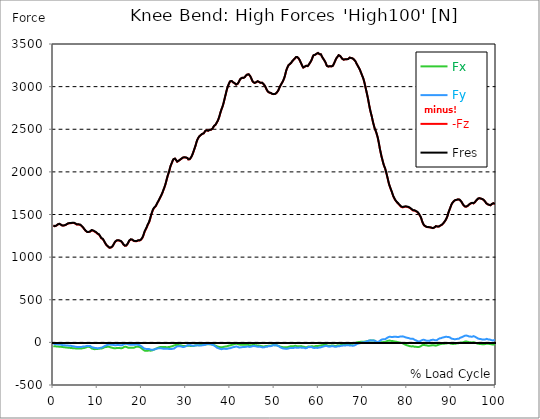
| Category |  Fx |  Fy |  -Fz |  Fres |
|---|---|---|---|---|
| 0.0 | -44.084 | -17.142 | 1370.774 | 1371.817 |
| 0.167348456675344 | -44.472 | -17.321 | 1363.819 | 1364.862 |
| 0.334696913350688 | -45.172 | -18.647 | 1362.27 | 1363.313 |
| 0.5020453700260321 | -45.976 | -20.017 | 1364.683 | 1365.77 |
| 0.669393826701376 | -47.54 | -22.668 | 1368.957 | 1370.194 |
| 0.83674228337672 | -48.687 | -23.651 | 1377.864 | 1379.159 |
| 1.0040907400520642 | -48.597 | -22.757 | 1382.838 | 1384.164 |
| 1.1621420602454444 | -49.297 | -23.025 | 1387.425 | 1388.81 |
| 1.3294905169207885 | -51.144 | -25.468 | 1389.838 | 1391.402 |
| 1.4968389735961325 | -50.533 | -24.649 | 1388.006 | 1389.525 |
| 1.6641874302714765 | -50.489 | -25.259 | 1381.051 | 1382.51 |
| 1.8315358869468206 | -53.184 | -29.28 | 1371.921 | 1373.44 |
| 1.9988843436221646 | -54.703 | -32.006 | 1369.866 | 1371.445 |
| 2.1662328002975086 | -55.15 | -32.274 | 1369.389 | 1370.998 |
| 2.333581256972853 | -56.193 | -33.034 | 1370.402 | 1372.07 |
| 2.5009297136481967 | -57.444 | -34.076 | 1371.757 | 1373.5 |
| 2.6682781703235405 | -58.203 | -34.687 | 1374.23 | 1376.002 |
| 2.8356266269988843 | -59.663 | -36.027 | 1377.551 | 1379.442 |
| 3.002975083674229 | -61.078 | -37.234 | 1383.925 | 1385.876 |
| 3.1703235403495724 | -61.54 | -37.457 | 1389.272 | 1391.253 |
| 3.337671997024917 | -62.001 | -37.68 | 1394.619 | 1396.629 |
| 3.4957233172182973 | -63.431 | -39.631 | 1397.3 | 1399.4 |
| 3.663071773893641 | -64.28 | -40.54 | 1397.032 | 1399.191 |
| 3.8304202305689854 | -64.161 | -39.914 | 1396.868 | 1398.997 |
| 3.997768687244329 | -64.95 | -41.002 | 1398.089 | 1400.308 |
| 4.165117143919673 | -66.395 | -42.953 | 1400.025 | 1402.393 |
| 4.332465600595017 | -67.944 | -44.904 | 1401.5 | 1404.046 |
| 4.499814057270361 | -68.748 | -46.527 | 1401.812 | 1404.478 |
| 4.667162513945706 | -69.195 | -47.823 | 1401.202 | 1403.942 |
| 4.834510970621049 | -69.359 | -48.791 | 1397.493 | 1400.219 |
| 5.001859427296393 | -70.729 | -50.787 | 1391.715 | 1394.544 |
| 5.169207883971737 | -72.114 | -52.767 | 1385.921 | 1388.87 |
| 5.336556340647081 | -73.216 | -54.391 | 1381.081 | 1384.134 |
| 5.503904797322425 | -72.442 | -53.825 | 1381.349 | 1384.327 |
| 5.671253253997769 | -71.488 | -53.274 | 1381.691 | 1384.61 |
| 5.82930457419115 | -71.399 | -53.289 | 1382.615 | 1385.504 |
| 5.996653030866494 | -71.965 | -54.733 | 1380.172 | 1383.151 |
| 6.164001487541838 | -72.218 | -55.761 | 1376.315 | 1379.353 |
| 6.331349944217181 | -71.503 | -55.523 | 1367.349 | 1370.357 |
| 6.498698400892526 | -69.537 | -51.68 | 1361.153 | 1363.909 |
| 6.66604685756787 | -67.974 | -49.193 | 1350.207 | 1352.813 |
| 6.833395314243213 | -66.633 | -47.644 | 1338.173 | 1340.675 |
| 7.000743770918558 | -66.037 | -48.299 | 1326.362 | 1328.909 |
| 7.168092227593902 | -63.684 | -47.272 | 1316.175 | 1318.588 |
| 7.335440684269246 | -60.259 | -45.231 | 1306.941 | 1309.16 |
| 7.50278914094459 | -56.833 | -43.176 | 1297.707 | 1299.733 |
| 7.6701375976199335 | -52.842 | -41.002 | 1293.537 | 1295.369 |
| 7.837486054295278 | -51.71 | -39.84 | 1294.401 | 1296.233 |
| 7.995537374488658 | -52.529 | -41.836 | 1294.252 | 1296.248 |
| 8.162885831164003 | -53.855 | -42.193 | 1296.382 | 1298.512 |
| 8.330234287839346 | -55.672 | -42.685 | 1299.807 | 1302.071 |
| 8.49758274451469 | -63.178 | -49.387 | 1309.518 | 1312.228 |
| 8.664931201190035 | -71.19 | -56.103 | 1315.118 | 1318.305 |
| 8.832279657865378 | -75.465 | -59.559 | 1313.033 | 1316.607 |
| 8.999628114540721 | -76.597 | -60.08 | 1308.982 | 1312.675 |
| 9.166976571216066 | -78.205 | -61.644 | 1304.29 | 1308.163 |
| 9.334325027891412 | -80.082 | -64.474 | 1298.929 | 1303.084 |
| 9.501673484566755 | -78.727 | -64.727 | 1292.748 | 1296.844 |
| 9.669021941242098 | -77.937 | -66.737 | 1288.429 | 1292.584 |
| 9.836370397917442 | -78.265 | -69.329 | 1283.499 | 1287.848 |
| 10.003718854592787 | -77.297 | -69.12 | 1272.463 | 1276.797 |
| 10.17106731126813 | -75.435 | -67.795 | 1266.521 | 1270.691 |
| 10.329118631461512 | -73.827 | -66.946 | 1263.125 | 1267.161 |
| 10.496467088136853 | -73.439 | -66.603 | 1251.731 | 1255.782 |
| 10.663815544812199 | -72.501 | -64.34 | 1235.617 | 1239.549 |
| 10.831164001487544 | -71.92 | -61.793 | 1220.589 | 1224.402 |
| 10.998512458162887 | -70.684 | -60.125 | 1217.938 | 1221.602 |
| 11.16586091483823 | -67.616 | -56.61 | 1211.951 | 1215.302 |
| 11.333209371513574 | -63.297 | -51.531 | 1200.826 | 1203.775 |
| 11.50055782818892 | -58.323 | -45.455 | 1184.741 | 1187.258 |
| 11.667906284864264 | -55.597 | -40.778 | 1168.313 | 1170.607 |
| 11.835254741539607 | -53.81 | -37.144 | 1153.509 | 1155.624 |
| 12.00260319821495 | -53.438 | -34.553 | 1141.163 | 1143.158 |
| 12.169951654890292 | -53.08 | -31.38 | 1132.137 | 1133.999 |
| 12.337300111565641 | -51.725 | -27.672 | 1125.018 | 1126.731 |
| 12.504648568240984 | -51.055 | -25.229 | 1117.78 | 1119.418 |
| 12.662699888434362 | -52.708 | -24.961 | 1109.216 | 1110.899 |
| 12.830048345109708 | -55.895 | -25.483 | 1107.921 | 1109.723 |
| 12.997396801785053 | -60.02 | -27.225 | 1111.897 | 1113.938 |
| 13.164745258460396 | -63.654 | -28.015 | 1116.306 | 1118.51 |
| 13.33209371513574 | -63.371 | -28.074 | 1124.05 | 1126.195 |
| 13.499442171811083 | -65.337 | -29.072 | 1135.712 | 1137.976 |
| 13.666790628486426 | -68.003 | -31.321 | 1151.558 | 1154.001 |
| 13.834139085161771 | -69.925 | -32.795 | 1168.15 | 1170.711 |
| 14.001487541837117 | -69.15 | -33.585 | 1180.645 | 1183.162 |
| 14.16883599851246 | -67.884 | -32.825 | 1188.643 | 1191.041 |
| 14.336184455187803 | -66.127 | -32.08 | 1194.288 | 1196.551 |
| 14.503532911863147 | -65.576 | -31.678 | 1197.043 | 1199.277 |
| 14.670881368538492 | -65.084 | -31.187 | 1196.819 | 1199.009 |
| 14.828932688731873 | -64.861 | -31.038 | 1194.436 | 1196.626 |
| 14.996281145407215 | -66.142 | -32.617 | 1191.86 | 1194.168 |
| 15.163629602082558 | -68.018 | -34.061 | 1188.36 | 1190.847 |
| 15.330978058757903 | -69.835 | -35.312 | 1184.383 | 1187.049 |
| 15.498326515433247 | -68.554 | -33.465 | 1174.747 | 1177.279 |
| 15.665674972108594 | -65.144 | -30.159 | 1162.624 | 1164.888 |
| 15.833023428783937 | -60.244 | -25.9 | 1148.416 | 1150.307 |
| 16.00037188545928 | -53.78 | -20.627 | 1139.882 | 1141.52 |
| 16.167720342134626 | -48.314 | -15.921 | 1133.195 | 1134.654 |
| 16.335068798809967 | -49.878 | -15.459 | 1133.329 | 1134.982 |
| 16.502417255485312 | -52.38 | -15.504 | 1135.354 | 1137.216 |
| 16.669765712160658 | -56.908 | -18.468 | 1144.261 | 1146.405 |
| 16.837114168836 | -61.793 | -22.534 | 1158.737 | 1161.299 |
| 17.004462625511344 | -64.161 | -25.155 | 1175.254 | 1178.039 |
| 17.16251394570472 | -65.293 | -26.912 | 1192.143 | 1195.032 |
| 17.32986240238007 | -64.563 | -26.987 | 1202.836 | 1205.577 |
| 17.497210859055414 | -62.999 | -26.168 | 1206.902 | 1209.33 |
| 17.664559315730756 | -63.446 | -27.24 | 1206.724 | 1209.032 |
| 17.8319077724061 | -64.28 | -28.774 | 1203.536 | 1205.815 |
| 17.999256229081443 | -64.101 | -28.908 | 1196.015 | 1198.264 |
| 18.166604685756788 | -62.463 | -28.149 | 1189.73 | 1191.92 |
| 18.333953142432133 | -60.765 | -28.208 | 1187.466 | 1189.551 |
| 18.501301599107478 | -56.446 | -26.704 | 1186.632 | 1188.568 |
| 18.668650055782823 | -52.514 | -25.274 | 1185.858 | 1187.749 |
| 18.835998512458165 | -48.955 | -24.023 | 1186.811 | 1188.673 |
| 19.00334696913351 | -49.312 | -25.438 | 1191.741 | 1193.588 |
| 19.170695425808855 | -51.01 | -27.717 | 1195.688 | 1197.534 |
| 19.338043882484197 | -52.797 | -30.546 | 1194.988 | 1196.909 |
| 19.496095202677576 | -55.076 | -34.389 | 1194.496 | 1196.522 |
| 19.66344365935292 | -58.874 | -37.844 | 1196.253 | 1198.502 |
| 19.830792116028263 | -64.503 | -43.593 | 1204.609 | 1207.29 |
| 19.998140572703612 | -71.548 | -49.67 | 1214.23 | 1217.447 |
| 20.165489029378953 | -78.548 | -56.252 | 1229.004 | 1232.906 |
| 20.3328374860543 | -86.516 | -64.012 | 1249.393 | 1254.144 |
| 20.500185942729644 | -94.186 | -71.518 | 1275.531 | 1281.191 |
| 20.667534399404985 | -97.239 | -74.854 | 1301.118 | 1307.105 |
| 20.83488285608033 | -96.122 | -73.871 | 1316.816 | 1322.594 |
| 21.002231312755672 | -97.507 | -76.463 | 1334.762 | 1340.72 |
| 21.16957976943102 | -98.565 | -78.622 | 1354.853 | 1360.945 |
| 21.336928226106362 | -97.343 | -78.19 | 1375.942 | 1381.825 |
| 21.504276682781704 | -95.452 | -77.341 | 1391.789 | 1397.419 |
| 21.67162513945705 | -95.645 | -78.995 | 1411.285 | 1416.959 |
| 21.82967645965043 | -96.554 | -81.914 | 1437.944 | 1443.752 |
| 21.997024916325774 | -97.135 | -84.982 | 1469.711 | 1475.609 |
| 22.16437337300112 | -96.226 | -86.784 | 1500.615 | 1506.424 |
| 22.33172182967646 | -93.739 | -87.409 | 1526.381 | 1531.966 |
| 22.499070286351806 | -90.924 | -87.663 | 1550.732 | 1556.078 |
| 22.666418743027148 | -87.201 | -85.741 | 1566.936 | 1571.925 |
| 22.833767199702496 | -82.42 | -83.597 | 1579.237 | 1583.75 |
| 23.00111565637784 | -77.922 | -79.754 | 1587.563 | 1591.599 |
| 23.168464113053183 | -73.916 | -76.15 | 1598.003 | 1601.637 |
| 23.335812569728528 | -70.625 | -73.916 | 1615.25 | 1618.601 |
| 23.50316102640387 | -66.857 | -71.98 | 1633.479 | 1636.547 |
| 23.670509483079215 | -63.029 | -70.818 | 1648.864 | 1651.694 |
| 23.83785793975456 | -60.393 | -70.148 | 1665.515 | 1668.226 |
| 23.995909259947936 | -56.431 | -67.75 | 1683.238 | 1685.77 |
| 24.163257716623285 | -53.616 | -66.648 | 1699.71 | 1702.108 |
| 24.330606173298627 | -53.289 | -68.256 | 1715.87 | 1718.297 |
| 24.49795462997397 | -53.661 | -70.461 | 1735.35 | 1737.882 |
| 24.665303086649313 | -54.048 | -72.665 | 1754.98 | 1757.616 |
| 24.83265154332466 | -54.748 | -75.242 | 1778.764 | 1781.52 |
| 25.0 | -54.495 | -75.971 | 1801.03 | 1803.815 |
| 25.167348456675345 | -54.465 | -75.867 | 1824.889 | 1827.66 |
| 25.334696913350694 | -54.808 | -74.303 | 1851.549 | 1854.259 |
| 25.502045370026035 | -56.416 | -74.616 | 1883.286 | 1885.967 |
| 25.669393826701377 | -57.608 | -75.941 | 1917.035 | 1919.686 |
| 25.836742283376722 | -56.952 | -75.941 | 1949.845 | 1952.377 |
| 26.004090740052067 | -55.284 | -75.927 | 1975.253 | 1977.8 |
| 26.17143919672741 | -53.274 | -76.418 | 2002.761 | 2005.293 |
| 26.329490516920792 | -52.782 | -78.339 | 2036.882 | 2039.444 |
| 26.49683897359613 | -51.293 | -79.307 | 2066.997 | 2069.529 |
| 26.66418743027148 | -48.016 | -78.116 | 2088.86 | 2091.243 |
| 26.831535886946828 | -45.306 | -76.507 | 2110.679 | 2112.913 |
| 26.998884343622166 | -42.595 | -74.899 | 2132.498 | 2134.598 |
| 27.166232800297514 | -39.691 | -74.124 | 2147.57 | 2149.595 |
| 27.333581256972852 | -35.953 | -71.161 | 2154.242 | 2156.104 |
| 27.5009297136482 | -32.483 | -64.637 | 2154.778 | 2156.446 |
| 27.668278170323543 | -30.636 | -56.908 | 2146.334 | 2147.853 |
| 27.835626626998888 | -29.951 | -51.561 | 2132.096 | 2133.585 |
| 28.002975083674233 | -29.846 | -47.242 | 2119.153 | 2120.613 |
| 28.170323540349575 | -31.41 | -47.599 | 2124.262 | 2125.736 |
| 28.33767199702492 | -31.723 | -46.11 | 2129.892 | 2131.366 |
| 28.50502045370026 | -32.855 | -45.514 | 2136.296 | 2137.785 |
| 28.663071773893645 | -34.359 | -45.455 | 2143.147 | 2144.651 |
| 28.830420230568986 | -35.238 | -45.961 | 2149.313 | 2150.876 |
| 28.99776868724433 | -37.621 | -49.208 | 2155.24 | 2156.908 |
| 29.165117143919673 | -41.165 | -53.289 | 2161.57 | 2163.327 |
| 29.33246560059502 | -43.444 | -55.374 | 2167.81 | 2169.642 |
| 29.499814057270367 | -43.697 | -54.138 | 2168.078 | 2169.895 |
| 29.66716251394571 | -43.772 | -51.561 | 2169.359 | 2171.191 |
| 29.834510970621054 | -43.831 | -48.925 | 2170.759 | 2172.606 |
| 30.00185942729639 | -41.895 | -43.742 | 2167.259 | 2169.076 |
| 30.169207883971744 | -40.123 | -37.725 | 2162.597 | 2164.4 |
| 30.33655634064708 | -39.631 | -34.225 | 2160.766 | 2162.583 |
| 30.50390479732243 | -39.453 | -32.78 | 2146.081 | 2147.913 |
| 30.671253253997772 | -39.527 | -32.691 | 2142.357 | 2144.174 |
| 30.829304574191156 | -40.748 | -33.451 | 2147.689 | 2149.61 |
| 30.996653030866494 | -41.582 | -33.555 | 2157.876 | 2159.902 |
| 31.164001487541842 | -42.267 | -34.553 | 2171.921 | 2174.065 |
| 31.331349944217187 | -43.027 | -37.055 | 2189.257 | 2191.506 |
| 31.498698400892525 | -43.459 | -40.123 | 2209.154 | 2211.448 |
| 31.666046857567874 | -42.789 | -40.48 | 2234.458 | 2236.633 |
| 31.833395314243212 | -40.153 | -39.497 | 2259.107 | 2261.043 |
| 32.00074377091856 | -36.161 | -37.472 | 2284.917 | 2286.57 |
| 32.1680922275939 | -32.17 | -35.461 | 2310.727 | 2312.097 |
| 32.33544068426925 | -32.631 | -35.521 | 2342.257 | 2343.523 |
| 32.50278914094459 | -32.646 | -34.702 | 2369.02 | 2370.137 |
| 32.670137597619934 | -32.244 | -34.508 | 2388.441 | 2389.454 |
| 32.83748605429528 | -32.08 | -34.851 | 2403.752 | 2404.69 |
| 33.004834510970625 | -32.81 | -36.176 | 2416.143 | 2417.051 |
| 33.162885831164004 | -31.812 | -36.668 | 2425.987 | 2426.836 |
| 33.33023428783935 | -29.117 | -36.161 | 2432.436 | 2433.211 |
| 33.497582744514695 | -26.763 | -35.61 | 2437.202 | 2437.917 |
| 33.664931201190036 | -26.644 | -34.642 | 2444.872 | 2445.572 |
| 33.83227965786538 | -25.17 | -33.153 | 2448.372 | 2449.057 |
| 33.99962811454073 | -23.636 | -31.559 | 2452.244 | 2452.9 |
| 34.16697657121607 | -23.77 | -30.085 | 2465.083 | 2465.738 |
| 34.33432502789141 | -23.874 | -28.015 | 2478.948 | 2479.589 |
| 34.50167348456676 | -23.77 | -25.006 | 2488.778 | 2489.403 |
| 34.6690219412421 | -23.055 | -21.372 | 2488.465 | 2489.091 |
| 34.83637039791744 | -21.238 | -17.917 | 2485.129 | 2485.755 |
| 35.00371885459279 | -20.881 | -17.932 | 2482.359 | 2482.97 |
| 35.17106731126814 | -21.298 | -19.138 | 2484.533 | 2485.129 |
| 35.338415767943474 | -22.176 | -20.583 | 2492.784 | 2493.365 |
| 35.49646708813686 | -22.727 | -21.089 | 2497.401 | 2497.982 |
| 35.6638155448122 | -23.025 | -22.221 | 2494.706 | 2495.286 |
| 35.831164001487544 | -23.993 | -24.946 | 2496.091 | 2496.657 |
| 35.998512458162885 | -26.376 | -28.893 | 2508.884 | 2509.48 |
| 36.165860914838234 | -28.908 | -32.304 | 2524.031 | 2524.656 |
| 36.333209371513576 | -31.768 | -36.578 | 2538.656 | 2539.371 |
| 36.50055782818892 | -34.761 | -42.223 | 2544.092 | 2544.956 |
| 36.667906284864266 | -38.142 | -48.538 | 2552.075 | 2553.117 |
| 36.83525474153961 | -42.685 | -55.731 | 2567.088 | 2568.443 |
| 37.002603198214956 | -47.391 | -62.523 | 2582.621 | 2584.334 |
| 37.1699516548903 | -50.444 | -66.871 | 2597.44 | 2599.362 |
| 37.337300111565646 | -52.112 | -69.18 | 2618.619 | 2620.629 |
| 37.50464856824098 | -53.214 | -72.203 | 2644.012 | 2646.037 |
| 37.66269988843437 | -55.016 | -75.003 | 2673.575 | 2675.631 |
| 37.83004834510971 | -57.295 | -77.952 | 2704.122 | 2706.237 |
| 37.99739680178505 | -58.635 | -80.127 | 2730.647 | 2732.821 |
| 38.16474525846039 | -57.772 | -79.412 | 2752.585 | 2754.73 |
| 38.33209371513574 | -54.838 | -75.599 | 2778.425 | 2780.436 |
| 38.49944217181109 | -51.635 | -72.859 | 2809.388 | 2811.235 |
| 38.666790628486424 | -49.967 | -73.216 | 2845.118 | 2846.905 |
| 38.83413908516178 | -51.769 | -77.416 | 2881.755 | 2883.602 |
| 39.001487541837115 | -49.55 | -76.984 | 2915.936 | 2917.738 |
| 39.16883599851246 | -47.674 | -76.612 | 2951.576 | 2953.318 |
| 39.336184455187805 | -45.231 | -75.361 | 2983.001 | 2984.684 |
| 39.503532911863154 | -41.568 | -72.188 | 3009.154 | 3010.643 |
| 39.670881368538495 | -38.023 | -70.014 | 3029.26 | 3030.66 |
| 39.83822982521384 | -37.174 | -70.342 | 3050.066 | 3051.421 |
| 39.996281145407224 | -35.342 | -68.093 | 3062.383 | 3063.604 |
| 40.163629602082565 | -31.634 | -64.384 | 3065.034 | 3066.076 |
| 40.33097805875791 | -28.863 | -61.659 | 3064.751 | 3065.704 |
| 40.498326515433256 | -26.153 | -58.174 | 3058.749 | 3059.613 |
| 40.6656749721086 | -24.678 | -55.761 | 3049.023 | 3049.857 |
| 40.83302342878393 | -22.742 | -54.361 | 3043.17 | 3043.989 |
| 41.00037188545929 | -20.493 | -53.304 | 3039.983 | 3040.772 |
| 41.16772034213463 | -17.589 | -50.325 | 3031.136 | 3031.881 |
| 41.33506879880997 | -14.938 | -47.54 | 3024.047 | 3024.747 |
| 41.50241725548531 | -15.608 | -48.359 | 3025.313 | 3026.043 |
| 41.66976571216066 | -19.436 | -53.05 | 3033.177 | 3034.055 |
| 41.837114168836 | -21.685 | -55.508 | 3045.747 | 3046.685 |
| 42.004462625511344 | -25.125 | -59.127 | 3062.725 | 3063.798 |
| 42.17181108218669 | -26.838 | -59.41 | 3078.78 | 3079.853 |
| 42.32986240238007 | -27.463 | -58.635 | 3091.872 | 3092.914 |
| 42.497210859055414 | -28.193 | -58.159 | 3100.301 | 3101.299 |
| 42.66455931573076 | -27.627 | -56.118 | 3102.848 | 3103.742 |
| 42.831907772406105 | -26.659 | -53.959 | 3102.714 | 3103.518 |
| 42.999256229081446 | -26.54 | -53.199 | 3101.701 | 3102.461 |
| 43.16660468575679 | -26.912 | -52.812 | 3103.563 | 3104.293 |
| 43.33395314243214 | -28.595 | -53.616 | 3113.154 | 3113.914 |
| 43.50130159910748 | -28.297 | -52.44 | 3126.901 | 3127.646 |
| 43.66865005578282 | -28.253 | -50.384 | 3137.118 | 3137.848 |
| 43.83599851245817 | -27.746 | -49.416 | 3141.66 | 3142.45 |
| 44.00334696913351 | -28.134 | -48.94 | 3142.822 | 3143.626 |
| 44.17069542580886 | -31.663 | -51.963 | 3143.82 | 3144.684 |
| 44.3380438824842 | -34.374 | -53.229 | 3138.488 | 3139.367 |
| 44.49609520267758 | -34.21 | -52.38 | 3123.952 | 3124.816 |
| 44.66344365935292 | -33.317 | -50.399 | 3106.899 | 3107.718 |
| 44.83079211602827 | -32.587 | -47.823 | 3086.57 | 3087.344 |
| 44.99814057270361 | -31.827 | -45.231 | 3066.3 | 3067.029 |
| 45.16548902937895 | -31.917 | -44.114 | 3054.117 | 3054.862 |
| 45.332837486054295 | -31.231 | -42.938 | 3046.477 | 3047.206 |
| 45.500185942729644 | -30.993 | -43.087 | 3043.155 | 3043.9 |
| 45.66753439940499 | -32.512 | -44.993 | 3045.226 | 3046.06 |
| 45.83488285608033 | -34.508 | -47.599 | 3050.2 | 3051.108 |
| 46.00223131275568 | -35.014 | -48.642 | 3055.532 | 3056.44 |
| 46.16957976943102 | -37.651 | -51.769 | 3062.666 | 3063.589 |
| 46.336928226106366 | -37.68 | -52.067 | 3060.476 | 3061.385 |
| 46.50427668278171 | -40.138 | -53.11 | 3054.638 | 3055.562 |
| 46.671625139457056 | -38.455 | -49.267 | 3047.072 | 3047.936 |
| 46.829676459650436 | -38.887 | -48.955 | 3043.811 | 3044.674 |
| 46.99702491632577 | -44.055 | -54.867 | 3046.328 | 3047.355 |
| 47.16437337300112 | -47.227 | -58.933 | 3045.777 | 3046.923 |
| 47.33172182967646 | -46.884 | -58.948 | 3038.658 | 3039.804 |
| 47.49907028635181 | -47.123 | -58.606 | 3030.704 | 3031.836 |
| 47.66641874302716 | -47.584 | -58.04 | 3021.366 | 3022.498 |
| 47.83376719970249 | -44.919 | -53.735 | 3007.307 | 3008.335 |
| 48.001115656377834 | -43.489 | -51.844 | 2990.09 | 2991.073 |
| 48.16846411305319 | -43.95 | -52.455 | 2971.905 | 2972.933 |
| 48.33581256972853 | -43.712 | -51.68 | 2954.852 | 2955.88 |
| 48.50316102640387 | -41.702 | -46.661 | 2941.821 | 2942.804 |
| 48.67050948307921 | -38.708 | -43.012 | 2933.719 | 2934.657 |
| 48.837857939754564 | -40.331 | -45.216 | 2929.742 | 2930.785 |
| 49.005206396429905 | -40.078 | -45.157 | 2927.582 | 2928.625 |
| 49.163257716623285 | -39.363 | -44.427 | 2924.842 | 2925.87 |
| 49.33060617329863 | -36.668 | -40.689 | 2919.57 | 2920.493 |
| 49.49795462997397 | -33.972 | -36.951 | 2914.298 | 2915.132 |
| 49.66530308664932 | -31.634 | -34.27 | 2910.678 | 2911.393 |
| 49.832651543324666 | -31.783 | -33.51 | 2911.781 | 2912.495 |
| 50.0 | -32.944 | -33.168 | 2912.927 | 2913.642 |
| 50.16734845667534 | -33.183 | -32.646 | 2914.536 | 2915.236 |
| 50.33469691335069 | -32.423 | -32.378 | 2918.349 | 2919.049 |
| 50.50204537002604 | -35.268 | -36.623 | 2928.848 | 2929.653 |
| 50.66939382670139 | -36.817 | -37.919 | 2940.078 | 2940.882 |
| 50.836742283376715 | -38.336 | -39.438 | 2952.529 | 2953.348 |
| 51.00409074005207 | -43.384 | -46.765 | 2972.665 | 2973.603 |
| 51.17143919672741 | -48.195 | -53.929 | 2993.337 | 2994.379 |
| 51.32949051692079 | -50.682 | -58.144 | 3010.256 | 3011.373 |
| 51.496838973596134 | -52.872 | -62.344 | 3026.147 | 3027.368 |
| 51.66418743027148 | -54.197 | -66.157 | 3040.817 | 3042.098 |
| 51.831535886946824 | -55.925 | -69.522 | 3055.904 | 3057.274 |
| 51.99888434362217 | -56.848 | -71.563 | 3074.253 | 3075.712 |
| 52.16623280029752 | -55.94 | -71.22 | 3094.999 | 3096.474 |
| 52.33358125697285 | -56.923 | -73.633 | 3121.316 | 3122.88 |
| 52.5009297136482 | -58.799 | -76.165 | 3156.375 | 3157.998 |
| 52.668278170323546 | -58.963 | -76.299 | 3189.706 | 3191.315 |
| 52.835626626998895 | -57.697 | -75.197 | 3212.791 | 3214.355 |
| 53.00297508367424 | -55.121 | -73.335 | 3232.853 | 3234.357 |
| 53.17032354034958 | -53.08 | -72.025 | 3250.472 | 3251.946 |
| 53.33767199702492 | -50.235 | -68.971 | 3260.51 | 3261.865 |
| 53.50502045370027 | -47.272 | -66.365 | 3265.142 | 3266.348 |
| 53.663071773893655 | -44.933 | -64.474 | 3270.593 | 3271.695 |
| 53.83042023056899 | -44.397 | -63.58 | 3282.909 | 3283.982 |
| 53.99776868724433 | -46.467 | -65.903 | 3296.775 | 3297.952 |
| 54.16511714391967 | -45.931 | -65.769 | 3306.456 | 3307.662 |
| 54.33246560059503 | -45.038 | -65.203 | 3315.213 | 3316.464 |
| 54.49981405727037 | -43.072 | -63.014 | 3321.349 | 3322.556 |
| 54.667162513945705 | -40.019 | -58.844 | 3332.609 | 3333.651 |
| 54.834510970621054 | -41.999 | -61.42 | 3344.881 | 3346.028 |
| 55.0018594272964 | -44.114 | -63.714 | 3351.136 | 3352.417 |
| 55.169207883971744 | -44.397 | -62.954 | 3345.387 | 3346.683 |
| 55.336556340647086 | -44.382 | -61.867 | 3338.149 | 3339.4 |
| 55.50390479732243 | -44.367 | -61.271 | 3327.768 | 3328.99 |
| 55.671253253997776 | -44.367 | -61.554 | 3312.071 | 3313.307 |
| 55.83860171067312 | -44.695 | -62.18 | 3294.526 | 3295.762 |
| 55.9966530308665 | -43.95 | -61.495 | 3274.271 | 3275.478 |
| 56.16400148754184 | -45.797 | -62.374 | 3255.997 | 3257.189 |
| 56.33134994421718 | -49.357 | -62.999 | 3237.068 | 3238.244 |
| 56.498698400892536 | -51.144 | -62.657 | 3223.38 | 3224.512 |
| 56.66604685756788 | -50.667 | -62.299 | 3223.961 | 3225.063 |
| 56.83339531424321 | -53.765 | -66.305 | 3233.255 | 3234.476 |
| 57.00074377091856 | -57.906 | -69.582 | 3241.416 | 3242.772 |
| 57.16809222759391 | -58.963 | -69.463 | 3243.844 | 3245.199 |
| 57.33544068426925 | -56.699 | -65.352 | 3243.144 | 3244.365 |
| 57.5027891409446 | -52.827 | -59.216 | 3240.061 | 3241.074 |
| 57.670137597619934 | -47.778 | -53.11 | 3247.865 | 3248.669 |
| 57.83748605429528 | -48.687 | -54.004 | 3262.312 | 3263.146 |
| 58.004834510970625 | -50.235 | -56.357 | 3277.578 | 3278.471 |
| 58.16288583116401 | -48.091 | -55.091 | 3290.341 | 3291.175 |
| 58.330234287839346 | -45.44 | -54.257 | 3306.381 | 3307.156 |
| 58.497582744514695 | -44.07 | -56.372 | 3327.634 | 3328.424 |
| 58.66493120119004 | -46.676 | -62.225 | 3351.553 | 3352.477 |
| 58.832279657865385 | -48.061 | -65.665 | 3367.489 | 3368.472 |
| 58.999628114540734 | -48.255 | -66.857 | 3371.257 | 3372.3 |
| 59.16697657121607 | -45.797 | -64.891 | 3372.881 | 3373.834 |
| 59.33432502789142 | -42.893 | -62.537 | 3374.34 | 3375.204 |
| 59.50167348456676 | -42.014 | -62.835 | 3384.631 | 3385.495 |
| 59.66902194124211 | -43.384 | -65.442 | 3395.325 | 3396.263 |
| 59.83637039791745 | -43.102 | -64.518 | 3394.297 | 3395.221 |
| 60.00371885459278 | -40.733 | -61.078 | 3387.133 | 3387.982 |
| 60.17106731126813 | -37.934 | -59.499 | 3380.506 | 3381.28 |
| 60.33841576794349 | -37.085 | -59.827 | 3382.293 | 3383.082 |
| 60.49646708813685 | -36.161 | -58.933 | 3378.346 | 3379.136 |
| 60.6638155448122 | -33.629 | -54.108 | 3358.732 | 3359.432 |
| 60.831164001487544 | -31.261 | -50.563 | 3342.379 | 3342.96 |
| 60.99851245816289 | -31.127 | -48.925 | 3328.99 | 3329.526 |
| 61.16586091483824 | -32.244 | -48.061 | 3316.33 | 3316.866 |
| 61.333209371513576 | -30.949 | -44.412 | 3301.69 | 3302.152 |
| 61.50055782818892 | -29.4 | -40.733 | 3287.973 | 3288.36 |
| 61.667906284864266 | -30.249 | -39.557 | 3265.142 | 3265.529 |
| 61.835254741539615 | -32.84 | -41.076 | 3244.142 | 3244.589 |
| 62.002603198214956 | -37.085 | -45.559 | 3236.65 | 3237.202 |
| 62.16995165489029 | -38.708 | -47.465 | 3234.908 | 3235.519 |
| 62.33730011156564 | -41.121 | -50.355 | 3237.097 | 3237.782 |
| 62.504648568240995 | -40.987 | -51.248 | 3239.182 | 3239.897 |
| 62.67199702491633 | -39.348 | -48.493 | 3238.095 | 3238.75 |
| 62.83004834510971 | -37.68 | -45.663 | 3236.978 | 3237.574 |
| 62.99739680178505 | -36.131 | -43.37 | 3237.738 | 3238.274 |
| 63.1647452584604 | -34.776 | -42.282 | 3242.787 | 3243.293 |
| 63.33209371513575 | -37.546 | -45.887 | 3256.757 | 3257.367 |
| 63.4994421718111 | -40.421 | -49.595 | 3275.865 | 3276.565 |
| 63.666790628486424 | -42.446 | -52.544 | 3295.479 | 3296.239 |
| 63.83413908516177 | -41.925 | -53.035 | 3315.496 | 3316.256 |
| 64.00148754183712 | -39.944 | -50.652 | 3332.37 | 3333.056 |
| 64.16883599851248 | -36.355 | -46.959 | 3342.826 | 3343.406 |
| 64.3361844551878 | -34.463 | -44.114 | 3355.411 | 3355.932 |
| 64.50353291186315 | -37.01 | -46.557 | 3368.293 | 3368.859 |
| 64.6708813685385 | -37.502 | -46.676 | 3370.364 | 3370.959 |
| 64.83822982521384 | -32.423 | -40.242 | 3360.221 | 3360.653 |
| 65.00557828188919 | -31.619 | -39.78 | 3348.857 | 3349.274 |
| 65.16362960208257 | -31.991 | -41.419 | 3337.255 | 3337.687 |
| 65.3309780587579 | -29.742 | -39.363 | 3325.296 | 3325.683 |
| 65.49832651543326 | -26.987 | -36.563 | 3317.194 | 3317.522 |
| 65.6656749721086 | -25.2 | -35.089 | 3316.181 | 3316.479 |
| 65.83302342878395 | -24.202 | -34.478 | 3316.211 | 3316.509 |
| 66.00037188545929 | -25.676 | -35.953 | 3321.156 | 3321.468 |
| 66.16772034213463 | -27.24 | -36.936 | 3325.251 | 3325.609 |
| 66.33506879880998 | -24.827 | -34.002 | 3321.051 | 3321.349 |
| 66.50241725548531 | -23.278 | -32.721 | 3321.007 | 3321.275 |
| 66.66976571216065 | -22.578 | -32.9 | 3324.194 | 3324.492 |
| 66.83711416883601 | -22.459 | -35.193 | 3332.624 | 3332.921 |
| 67.00446262551135 | -21.223 | -36.682 | 3339.728 | 3340.026 |
| 67.1718110821867 | -20.419 | -38.008 | 3340.696 | 3341.024 |
| 67.32986240238007 | -16.621 | -36.042 | 3335.409 | 3335.677 |
| 67.49721085905541 | -16.487 | -38.663 | 3334.843 | 3335.156 |
| 67.66455931573076 | -15.34 | -39.736 | 3330.851 | 3331.179 |
| 67.83190777240611 | -13.91 | -40.227 | 3326.041 | 3326.383 |
| 67.99925622908145 | -10.693 | -36.772 | 3315.854 | 3316.152 |
| 68.16660468575678 | -8.891 | -33.763 | 3306.918 | 3307.171 |
| 68.33395314243214 | -6.434 | -29.727 | 3294.377 | 3294.616 |
| 68.50130159910749 | -2.502 | -24.127 | 3276.52 | 3276.758 |
| 68.66865005578282 | 0.611 | -18.468 | 3259.199 | 3259.452 |
| 68.83599851245816 | 1.46 | -16.576 | 3243.546 | 3243.814 |
| 69.00334696913352 | 3.321 | -13.374 | 3228.355 | 3228.638 |
| 69.17069542580886 | 5.168 | -10.172 | 3213.164 | 3213.461 |
| 69.3380438824842 | 5.287 | -9.711 | 3194.636 | 3194.979 |
| 69.50539233915956 | 6.106 | -7.596 | 3172.311 | 3172.698 |
| 69.66344365935292 | 8.608 | -2.189 | 3149.852 | 3150.373 |
| 69.83079211602826 | 11.453 | 3.872 | 3127.526 | 3128.197 |
| 69.99814057270362 | 8.221 | 0.387 | 3106.869 | 3107.554 |
| 70.16548902937896 | 7.134 | -0.819 | 3080.225 | 3080.94 |
| 70.33283748605429 | 8.742 | 1.549 | 3047.594 | 3048.308 |
| 70.50018594272964 | 9.889 | 4.87 | 3009.303 | 3010.077 |
| 70.667534399405 | 11.096 | 7.908 | 2970.714 | 2971.592 |
| 70.83488285608033 | 12.376 | 10.991 | 2932.08 | 2933.048 |
| 71.00223131275568 | 13.791 | 13.955 | 2892.985 | 2894.072 |
| 71.16957976943102 | 16.204 | 17.008 | 2851.09 | 2852.326 |
| 71.33692822610637 | 19.347 | 20.374 | 2803.744 | 2805.01 |
| 71.50427668278171 | 21.417 | 22.861 | 2757.827 | 2759.093 |
| 71.67162513945706 | 21.998 | 23.487 | 2716.93 | 2718.166 |
| 71.8389735961324 | 21.774 | 22.981 | 2681.156 | 2682.377 |
| 71.99702491632577 | 21.998 | 23.338 | 2648.793 | 2650.029 |
| 72.16437337300113 | 22.906 | 24.604 | 2607.687 | 2608.878 |
| 72.33172182967647 | 21.715 | 23.368 | 2570.796 | 2571.987 |
| 72.49907028635181 | 20.672 | 21.908 | 2538.522 | 2539.699 |
| 72.66641874302715 | 19.198 | 19.704 | 2507.767 | 2508.914 |
| 72.8337671997025 | 13.762 | 12.898 | 2486.142 | 2487.035 |
| 73.00111565637783 | 7.372 | 6.911 | 2463.832 | 2464.517 |
| 73.16846411305319 | 3.991 | 5.868 | 2434.685 | 2435.445 |
| 73.33581256972853 | 1.43 | 5.287 | 2404.347 | 2405.196 |
| 73.50316102640387 | 1.072 | 7.089 | 2362.586 | 2363.51 |
| 73.67050948307921 | 0.938 | 10.783 | 2317.593 | 2318.561 |
| 73.83785793975457 | 1.891 | 20.106 | 2268.653 | 2269.651 |
| 74.00520639642991 | 1.981 | 26.346 | 2227.577 | 2228.65 |
| 74.16325771662328 | 2.308 | 31.038 | 2187.603 | 2188.735 |
| 74.33060617329863 | 2.174 | 33.748 | 2153.095 | 2154.317 |
| 74.49795462997398 | 2.845 | 36.206 | 2119.466 | 2120.807 |
| 74.66530308664932 | 3.589 | 37.799 | 2087.788 | 2089.188 |
| 74.83265154332466 | 4.185 | 37.219 | 2062.737 | 2064.122 |
| 75.00000000000001 | 4.23 | 36.965 | 2041.588 | 2042.988 |
| 75.16734845667534 | 7.938 | 41.344 | 2011.712 | 2013.231 |
| 75.3346969133507 | 12.6 | 47.748 | 1977.77 | 1979.289 |
| 75.50204537002605 | 16.413 | 54.257 | 1941.743 | 1943.456 |
| 75.66939382670138 | 19.019 | 59.41 | 1904.852 | 1906.788 |
| 75.83674228337672 | 21.074 | 64.191 | 1867.663 | 1869.659 |
| 76.00409074005208 | 21.074 | 66.157 | 1838.934 | 1841.064 |
| 76.17143919672742 | 19.227 | 65.04 | 1814.911 | 1816.996 |
| 76.33878765340276 | 17.619 | 64.235 | 1791.037 | 1793.122 |
| 76.49683897359614 | 16.338 | 63.267 | 1768.637 | 1770.677 |
| 76.66418743027148 | 15.37 | 63.371 | 1742.618 | 1744.673 |
| 76.83153588694682 | 14.759 | 66.127 | 1717.314 | 1719.608 |
| 76.99888434362218 | 12.54 | 65.203 | 1698.698 | 1701.021 |
| 77.16623280029752 | 10.679 | 65.382 | 1682.017 | 1684.355 |
| 77.33358125697285 | 8.996 | 65.635 | 1666.141 | 1668.523 |
| 77.5009297136482 | 7.506 | 64.563 | 1655.134 | 1657.547 |
| 77.66827817032356 | 5.972 | 64.25 | 1644.247 | 1646.72 |
| 77.83562662699889 | 3.694 | 64.31 | 1634.596 | 1637.292 |
| 78.00297508367423 | 0.149 | 62.567 | 1626.643 | 1629.607 |
| 78.17032354034959 | -0.223 | 64.459 | 1616.605 | 1619.882 |
| 78.33767199702493 | -0.194 | 67.527 | 1605.971 | 1609.709 |
| 78.50502045370027 | -2.189 | 68.718 | 1596.514 | 1600.595 |
| 78.67236891037561 | -5.257 | 68.748 | 1589.38 | 1593.699 |
| 78.83042023056899 | -9.07 | 68.808 | 1585.076 | 1589.529 |
| 78.99776868724433 | -11.125 | 70.52 | 1583.333 | 1587.92 |
| 79.16511714391969 | -16.517 | 67.497 | 1584.882 | 1589.633 |
| 79.33246560059503 | -20.583 | 64.935 | 1588.65 | 1593.252 |
| 79.49981405727036 | -24.351 | 62.24 | 1591.688 | 1596.052 |
| 79.66716251394571 | -28.7 | 58.606 | 1591.718 | 1596.112 |
| 79.83451097062107 | -32.423 | 55.672 | 1590.422 | 1594.786 |
| 80.00185942729641 | -35.342 | 53.78 | 1588.784 | 1593.044 |
| 80.16920788397174 | -37.77 | 52.41 | 1586.357 | 1590.571 |
| 80.33655634064709 | -40.197 | 50.921 | 1583.84 | 1588.01 |
| 80.50390479732243 | -42.506 | 47.733 | 1579.937 | 1583.914 |
| 80.67125325399778 | -45.455 | 44.159 | 1573.935 | 1577.808 |
| 80.83860171067312 | -47.495 | 41.806 | 1566.102 | 1569.959 |
| 80.99665303086651 | -47.45 | 41.538 | 1560.219 | 1564.076 |
| 81.16400148754184 | -45.365 | 42.819 | 1551.297 | 1555.229 |
| 81.3313499442172 | -46.006 | 41.493 | 1546.323 | 1550.389 |
| 81.49869840089255 | -48.21 | 36.534 | 1545.146 | 1548.959 |
| 81.66604685756786 | -51.159 | 30.68 | 1545.698 | 1549.51 |
| 81.83339531424322 | -51.65 | 26.883 | 1541.468 | 1545.206 |
| 82.00074377091858 | -51.725 | 22.951 | 1536.866 | 1540.455 |
| 82.16809222759392 | -52.291 | 18.885 | 1532.115 | 1535.555 |
| 82.33544068426926 | -55.001 | 14.536 | 1527.245 | 1530.491 |
| 82.50278914094459 | -55.344 | 11.751 | 1518.383 | 1521.466 |
| 82.67013759761994 | -53.706 | 10.291 | 1506.126 | 1509.075 |
| 82.83748605429528 | -51.084 | 12.555 | 1489.356 | 1492.022 |
| 83.00483451097062 | -47.689 | 15.951 | 1475.564 | 1477.918 |
| 83.17218296764597 | -41.836 | 19.391 | 1456.114 | 1458.02 |
| 83.33023428783935 | -34.538 | 25.974 | 1427.608 | 1429.067 |
| 83.4975827445147 | -30.412 | 29.638 | 1403.585 | 1404.851 |
| 83.66493120119004 | -29.012 | 31.008 | 1385.534 | 1386.696 |
| 83.83227965786537 | -30.055 | 30.487 | 1372.666 | 1373.768 |
| 83.99962811454073 | -32.378 | 26.957 | 1365.919 | 1366.902 |
| 84.16697657121607 | -33.465 | 23.725 | 1360.081 | 1361.004 |
| 84.33432502789142 | -34.553 | 20.493 | 1354.243 | 1355.092 |
| 84.50167348456677 | -37.382 | 18.527 | 1352.053 | 1352.947 |
| 84.6690219412421 | -38.961 | 18.676 | 1349.656 | 1350.594 |
| 84.83637039791745 | -40.406 | 16.651 | 1351.428 | 1352.366 |
| 85.0037188545928 | -39.006 | 17.425 | 1350.758 | 1351.592 |
| 85.17106731126813 | -37.68 | 21.878 | 1349.462 | 1350.281 |
| 85.33841576794349 | -36.355 | 26.346 | 1348.166 | 1348.971 |
| 85.50576422461883 | -34.687 | 28.297 | 1344.562 | 1345.322 |
| 85.66381554481221 | -33.242 | 29.414 | 1341.732 | 1342.477 |
| 85.83116400148755 | -32.066 | 30.263 | 1340.094 | 1340.824 |
| 85.99851245816289 | -32.483 | 29.891 | 1342.79 | 1343.534 |
| 86.16586091483823 | -35.193 | 28.461 | 1348.3 | 1349.09 |
| 86.33320937151358 | -38.604 | 23.576 | 1357.475 | 1358.279 |
| 86.50055782818893 | -39.199 | 21.61 | 1362.628 | 1363.417 |
| 86.66790628486427 | -35.923 | 24.455 | 1361.704 | 1362.464 |
| 86.83525474153961 | -32.542 | 30.308 | 1358.532 | 1359.336 |
| 87.00260319821496 | -29.534 | 36.891 | 1357.281 | 1358.19 |
| 87.16995165489031 | -26.123 | 42.506 | 1358.636 | 1359.634 |
| 87.33730011156564 | -22.846 | 47.033 | 1362.017 | 1363.089 |
| 87.504648568241 | -19.421 | 49.312 | 1369.702 | 1370.819 |
| 87.67199702491634 | -18.706 | 49.401 | 1378.564 | 1379.651 |
| 87.83004834510972 | -17.276 | 52.916 | 1378.355 | 1379.591 |
| 87.99739680178506 | -15.727 | 56.625 | 1385.683 | 1387.068 |
| 88.1647452584604 | -15.251 | 58.74 | 1395.825 | 1397.3 |
| 88.33209371513574 | -15.296 | 60.661 | 1406.802 | 1408.336 |
| 88.49944217181108 | -14.015 | 63.416 | 1418.642 | 1420.265 |
| 88.66679062848644 | -13.642 | 64.831 | 1431.912 | 1433.565 |
| 88.83413908516178 | -14.655 | 64.057 | 1447.565 | 1449.158 |
| 89.00148754183712 | -11.483 | 64.533 | 1466.42 | 1467.969 |
| 89.16883599851246 | -10.128 | 62.791 | 1490.13 | 1491.575 |
| 89.33618445518782 | -8.221 | 62.582 | 1522.315 | 1523.715 |
| 89.50353291186315 | -9.264 | 61.316 | 1545.295 | 1546.651 |
| 89.6708813685385 | -11.185 | 58.501 | 1567.501 | 1568.797 |
| 89.83822982521386 | -14.268 | 51.531 | 1591.063 | 1592.239 |
| 90.00557828188919 | -17.351 | 44.546 | 1614.624 | 1615.697 |
| 90.16362960208257 | -18.289 | 41.419 | 1631.394 | 1632.437 |
| 90.3309780587579 | -17.857 | 40.704 | 1642.683 | 1643.741 |
| 90.49832651543326 | -17.947 | 38.961 | 1652.647 | 1653.645 |
| 90.66567497210859 | -17.41 | 37.263 | 1661.643 | 1662.581 |
| 90.83302342878395 | -16.651 | 37.293 | 1667.779 | 1668.687 |
| 91.00037188545929 | -15.176 | 38.157 | 1669.626 | 1670.519 |
| 91.16772034213463 | -12.555 | 40.763 | 1671.145 | 1672.083 |
| 91.33506879880998 | -10.932 | 41.344 | 1672.023 | 1672.962 |
| 91.50241725548533 | -11.23 | 39.825 | 1676.834 | 1677.713 |
| 91.66976571216065 | -9.413 | 42.148 | 1678.428 | 1679.306 |
| 91.83711416883601 | -5.838 | 48.225 | 1673.662 | 1674.63 |
| 92.00446262551137 | -2.889 | 54.852 | 1665.217 | 1666.364 |
| 92.1718110821867 | -1.683 | 58.65 | 1655.239 | 1656.519 |
| 92.33915953886203 | -1.608 | 60.423 | 1643.428 | 1644.783 |
| 92.49721085905541 | -0.462 | 64.295 | 1627.939 | 1629.398 |
| 92.66455931573077 | 1.281 | 69.001 | 1613.388 | 1615.026 |
| 92.83190777240611 | 4.915 | 73.097 | 1603.99 | 1605.807 |
| 92.99925622908145 | 8.549 | 77.178 | 1594.593 | 1596.588 |
| 93.1666046857568 | 9.83 | 80.558 | 1588.948 | 1591.167 |
| 93.33395314243214 | 10.053 | 80.767 | 1590.408 | 1592.656 |
| 93.50130159910749 | 9.815 | 79.918 | 1593.714 | 1595.933 |
| 93.66865005578283 | 7.536 | 76.299 | 1599.969 | 1601.995 |
| 93.83599851245818 | 3.842 | 71.056 | 1606.716 | 1608.533 |
| 94.00334696913353 | 2.517 | 69.448 | 1615.503 | 1617.275 |
| 94.17069542580886 | 0.566 | 67.899 | 1623.858 | 1625.601 |
| 94.3380438824842 | 0.581 | 67.869 | 1628.281 | 1629.994 |
| 94.50539233915954 | -0.089 | 66.722 | 1633.226 | 1634.894 |
| 94.66344365935292 | -0.998 | 65.933 | 1635.669 | 1637.292 |
| 94.83079211602828 | 1.132 | 69.999 | 1633.539 | 1635.296 |
| 94.99814057270362 | 2.04 | 73.142 | 1630.411 | 1632.318 |
| 95.16548902937897 | 0.655 | 72.099 | 1635.549 | 1637.381 |
| 95.33283748605432 | -2.74 | 67.05 | 1644.858 | 1646.451 |
| 95.50018594272963 | -6.285 | 61.927 | 1655.909 | 1657.279 |
| 95.66753439940499 | -10.053 | 55.791 | 1667.228 | 1668.389 |
| 95.83488285608034 | -13.896 | 49.461 | 1678.025 | 1678.979 |
| 96.00223131275567 | -15.698 | 46.095 | 1685.115 | 1685.979 |
| 96.16957976943102 | -16.949 | 43.027 | 1689.657 | 1690.432 |
| 96.33692822610638 | -17.961 | 40.599 | 1691.027 | 1691.757 |
| 96.50427668278171 | -18.691 | 39.065 | 1689.076 | 1689.776 |
| 96.67162513945706 | -18.751 | 37.948 | 1685.993 | 1686.693 |
| 96.8389735961324 | -19.778 | 36.712 | 1680.945 | 1681.659 |
| 96.99702491632577 | -22.012 | 33.585 | 1680.796 | 1681.525 |
| 97.16437337300111 | -23.234 | 31.753 | 1676.313 | 1677.087 |
| 97.33172182967647 | -21.923 | 33.242 | 1668.583 | 1669.372 |
| 97.49907028635181 | -22.191 | 31.991 | 1661.449 | 1662.298 |
| 97.66641874302715 | -19.853 | 34.955 | 1648.477 | 1649.296 |
| 97.8337671997025 | -16.636 | 39.885 | 1633.852 | 1634.641 |
| 98.00111565637785 | -14.655 | 41.463 | 1624.901 | 1625.675 |
| 98.16846411305319 | -14.893 | 39.944 | 1620.343 | 1621.088 |
| 98.33581256972855 | -17.202 | 34.597 | 1616.963 | 1617.722 |
| 98.50316102640389 | -17.902 | 33.972 | 1613.15 | 1613.909 |
| 98.67050948307921 | -18.438 | 33.674 | 1608.518 | 1609.278 |
| 98.83785793975456 | -19.585 | 31.395 | 1607.624 | 1608.369 |
| 99.0052063964299 | -21.804 | 26.823 | 1611.973 | 1612.658 |
| 99.17255485310525 | -24.574 | 23.323 | 1623.456 | 1624.096 |
| 99.33060617329863 | -25.795 | 22.683 | 1634.269 | 1634.879 |
| 99.49795462997399 | -25.84 | 24.738 | 1631.871 | 1632.496 |
| 99.66530308664933 | -24.723 | 25.795 | 1627.299 | 1627.879 |
| 99.83265154332467 | -23.591 | 26.853 | 1622.726 | 1623.262 |
| 100.0 | -23.621 | 27.583 | 1623.143 | 1623.694 |